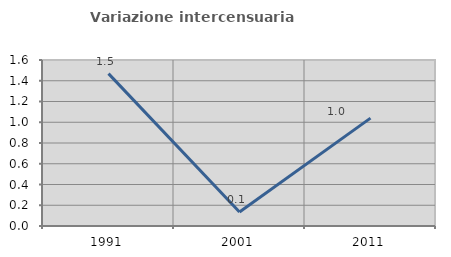
| Category | Variazione intercensuaria annua |
|---|---|
| 1991.0 | 1.469 |
| 2001.0 | 0.135 |
| 2011.0 | 1.04 |